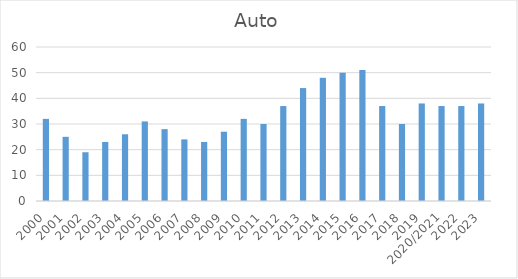
| Category | Auto |
|---|---|
| 2000 | 32 |
| 2001 | 25 |
| 2002 | 19 |
| 2003 | 23 |
| 2004 | 26 |
| 2005 | 31 |
| 2006 | 28 |
| 2007 | 24 |
| 2008 | 23 |
| 2009 | 27 |
| 2010 | 32 |
| 2011 | 30 |
| 2012 | 37 |
| 2013 | 44 |
| 2014 | 48 |
| 2015 | 50 |
| 2016 | 51 |
| 2017 | 37 |
| 2018 | 30 |
| 2019 | 38 |
| 2020/2021 | 37 |
| 2022 | 37 |
| 2023 | 38 |